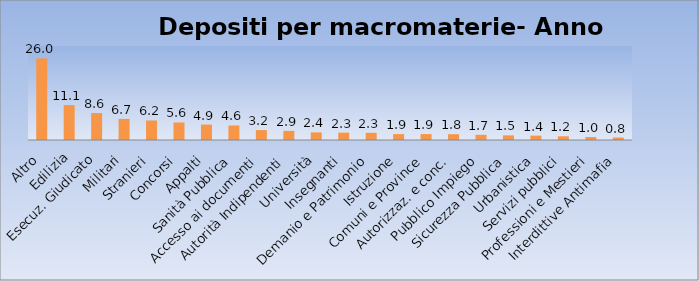
| Category | Series 0 |
|---|---|
| Altro | 26.046 |
| Edilizia | 11.138 |
| Esecuz. Giudicato | 8.6 |
| Militari | 6.732 |
| Stranieri | 6.228 |
| Concorsi | 5.596 |
| Appalti | 4.915 |
| Sanità Pubblica | 4.628 |
| Accesso ai documenti | 3.169 |
| Autorità Indipendenti | 2.926 |
| Università | 2.429 |
| Insegnanti | 2.348 |
| Demanio e Patrimonio | 2.3 |
| Istruzione | 1.885 |
| Comuni e Province | 1.885 |
| Autorizzaz. e conc. | 1.848 |
| Pubblico Impiego | 1.667 |
| Sicurezza Pubblica | 1.475 |
| Urbanistica | 1.391 |
| Servizi pubblici | 1.19 |
| Professioni e Mestieri | 0.965 |
| Interdittive Antimafia | 0.778 |